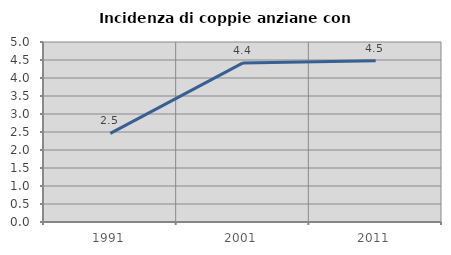
| Category | Incidenza di coppie anziane con figli |
|---|---|
| 1991.0 | 2.462 |
| 2001.0 | 4.42 |
| 2011.0 | 4.482 |